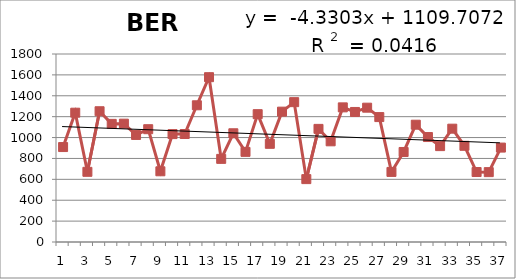
| Category | 1976-2012 |
|---|---|
| 0 | 909 |
| 1 | 1238 |
| 2 | 672 |
| 3 | 1252 |
| 4 | 1131 |
| 5 | 1133 |
| 6 | 1025 |
| 7 | 1080 |
| 8 | 677 |
| 9 | 1033 |
| 10 | 1034 |
| 11 | 1309 |
| 12 | 1578 |
| 13 | 796 |
| 14 | 1041 |
| 15 | 863 |
| 16 | 1224 |
| 17 | 940 |
| 18 | 1248 |
| 19 | 1339 |
| 20 | 602 |
| 21 | 1083 |
| 22 | 964 |
| 23 | 1289 |
| 24 | 1245 |
| 25 | 1286 |
| 26 | 1196 |
| 27 | 671 |
| 28 | 862 |
| 29 | 1123 |
| 30 | 1005 |
| 31 | 918 |
| 32 | 1085 |
| 33 | 921 |
| 34 | 670 |
| 35 | 669 |
| 36 | 904 |